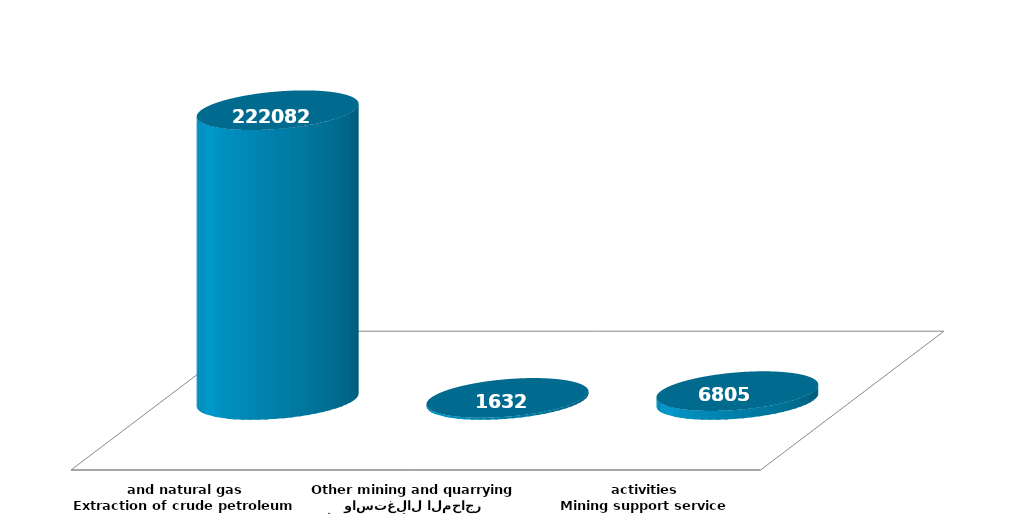
| Category | Series 1 |
|---|---|
| استخراج النفط الخام والغاز الطبيعي
Extraction of crude petroleum and natural gas | 222082407 |
| الأنشطة الأخرى للتعدين واستغلال المحاجر
Other mining and quarrying | 1631717 |
| انشطة خدمات دعم التعدين
Mining support service activities | 6805156 |